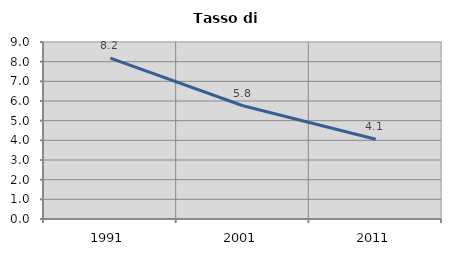
| Category | Tasso di disoccupazione   |
|---|---|
| 1991.0 | 8.179 |
| 2001.0 | 5.759 |
| 2011.0 | 4.057 |